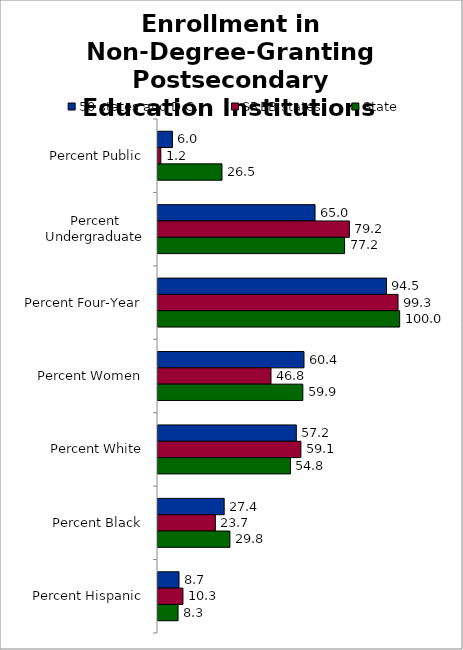
| Category | 50 states and D.C. | SREB states | State |
|---|---|---|---|
| Percent Public | 5.975 | 1.171 | 26.475 |
| Percent Undergraduate | 64.985 | 79.2 | 77.208 |
| Percent Four-Year | 94.546 | 99.327 | 100 |
| Percent Women | 60.412 | 46.76 | 59.935 |
| Percent White | 57.233 | 59.125 | 54.799 |
| Percent Black | 27.387 | 23.735 | 29.76 |
| Percent Hispanic | 8.693 | 10.319 | 8.296 |